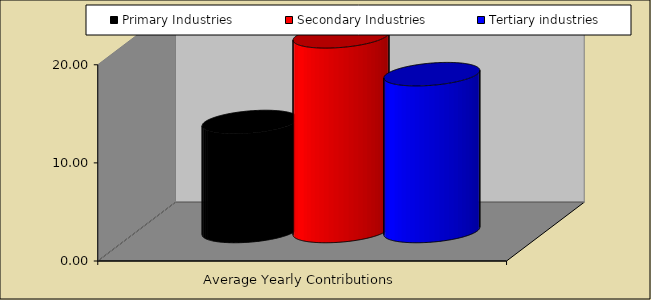
| Category | Primary Industries | Secondary Industries | Tertiary industries |
|---|---|---|---|
| Average Yearly Contributions | 11.11 | 19.841 | 15.985 |